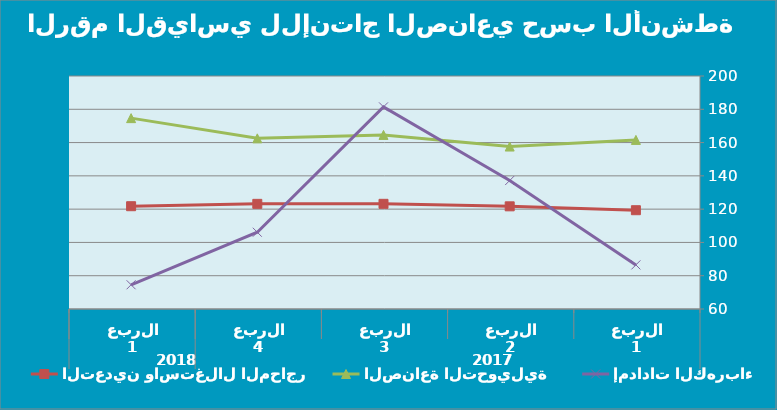
| Category | IIPالرقم القياسي العام  | التعدين واستغلال المحاجر | الصناعة التحويلية | إمدادات الكهرباء |
|---|---|---|---|---|
| 0 |  | 119.36 | 161.6 | 86.5 |
| 1 |  | 121.69 | 157.62 | 137.2 |
| 2 |  | 123.2 | 164.6 | 181.44 |
| 3 |  | 123.18 | 162.54 | 106.12 |
| 4 |  | 121.76 | 174.68 | 74.56 |